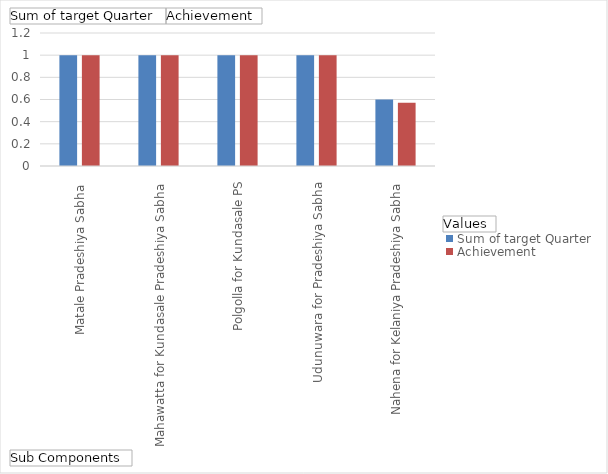
| Category | Sum of target Quarter | Achievement |
|---|---|---|
| Matale Pradeshiya Sabha  | 1 | 1 |
| Mahawatta for Kundasale Pradeshiya Sabha  | 1 | 1 |
| Polgolla for Kundasale PS | 1 | 1 |
|  Udunuwara for Pradeshiya Sabha  | 1 | 1 |
| Nahena for Kelaniya Pradeshiya Sabha  | 0.6 | 0.57 |